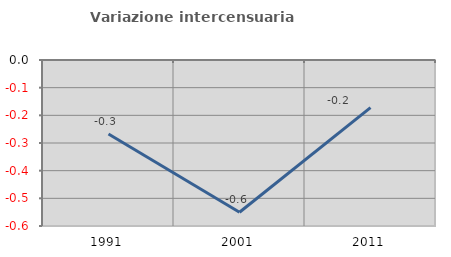
| Category | Variazione intercensuaria annua |
|---|---|
| 1991.0 | -0.268 |
| 2001.0 | -0.55 |
| 2011.0 | -0.172 |